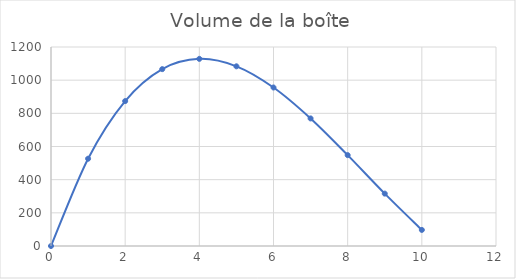
| Category | Volume de la boîte
 |
|---|---|
| 0.0 | 0 |
| 1.0 | 526.3 |
| 2.0 | 873.8 |
| 3.0 | 1066.5 |
| 4.0 | 1128.4 |
| 5.0 | 1083.5 |
| 6.0 | 955.8 |
| 7.0 | 769.3 |
| 8.0 | 548 |
| 9.0 | 315.9 |
| 10.0 | 97 |